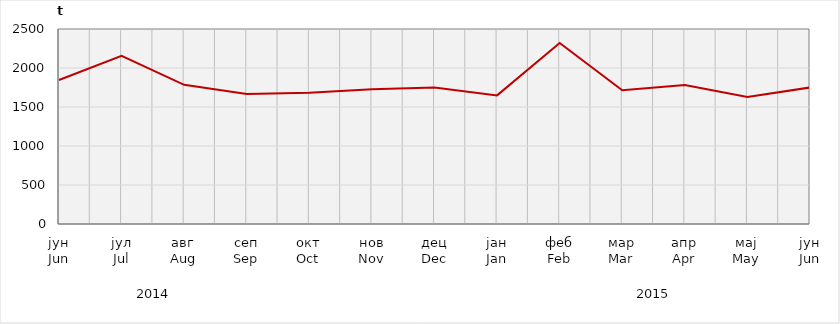
| Category | Нето тежина заклане стоке                              Net weight of  slaughtered livestock |
|---|---|
| јун
Jun | 1846464.11 |
| јул
Jul | 2155166.5 |
| авг
Aug | 1783969.1 |
| сеп
Sep | 1665798.6 |
| окт
Oct | 1681528.4 |
| нов
Nov | 1726709.59 |
| дец
Dec | 1751098 |
| јан
Jan | 1649074.16 |
| феб
Feb | 2321007.9 |
| мар
Mar | 1714725.6 |
| апр
Apr | 1780678.65 |
| мај
May | 1628212.69 |
| јун
Jun | 1750405.16 |